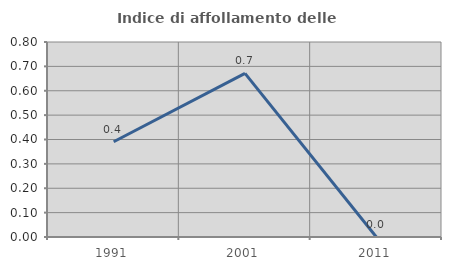
| Category | Indice di affollamento delle abitazioni  |
|---|---|
| 1991.0 | 0.391 |
| 2001.0 | 0.671 |
| 2011.0 | 0 |